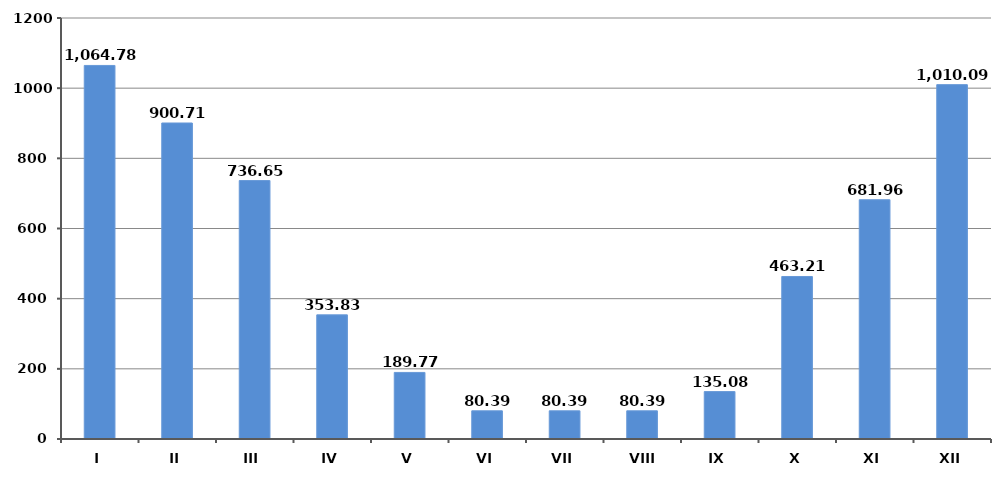
| Category | Series 0 |
|---|---|
| I | 1064.779 |
| II | 900.715 |
| III | 736.651 |
| IV | 353.835 |
| V | 189.771 |
| VI | 80.395 |
| VII | 80.395 |
| VIII | 80.395 |
| IX | 135.083 |
| X | 463.211 |
| XI | 681.963 |
| XII | 1010.091 |